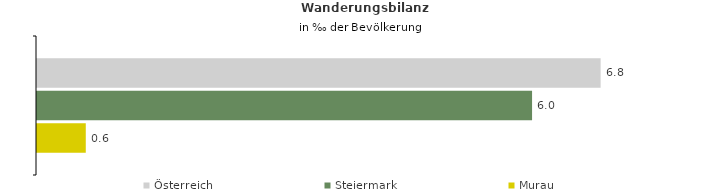
| Category | Österreich | Steiermark | Murau |
|---|---|---|---|
| Wanderungsrate in ‰ der Bevölkerung, Periode 2018-2022 | 6.822 | 5.992 | 0.59 |